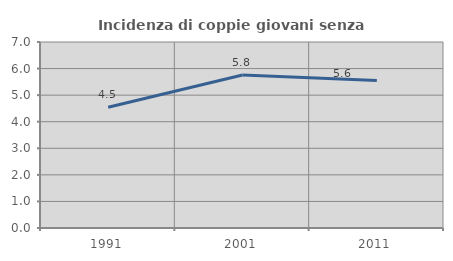
| Category | Incidenza di coppie giovani senza figli |
|---|---|
| 1991.0 | 4.545 |
| 2001.0 | 5.755 |
| 2011.0 | 5.556 |